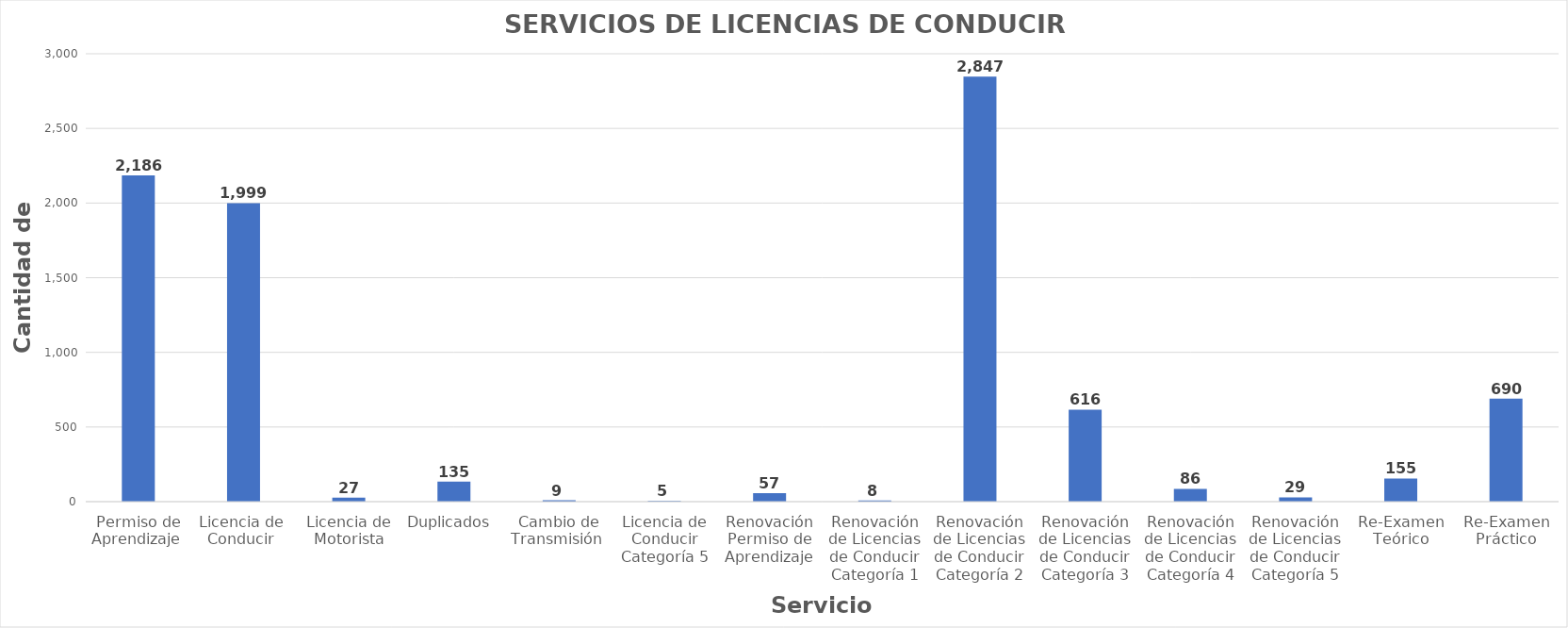
| Category | Series 0 |
|---|---|
| Permiso de Aprendizaje  | 2186 |
| Licencia de  Conducir  | 1999 |
| Licencia de Motorista | 27 |
| Duplicados  | 135 |
| Cambio de Transmisión  | 9 |
| Licencia de Conducir Categoría 5 | 5 |
| Renovación Permiso de Aprendizaje | 57 |
| Renovación de Licencias de Conducir Categoría 1 | 8 |
| Renovación de Licencias de Conducir Categoría 2 | 2847 |
| Renovación de Licencias de Conducir Categoría 3 | 616 |
| Renovación de Licencias de Conducir Categoría 4 | 86 |
| Renovación de Licencias de Conducir Categoría 5 | 29 |
| Re-Examen Teórico | 155 |
| Re-Examen Práctico | 690 |